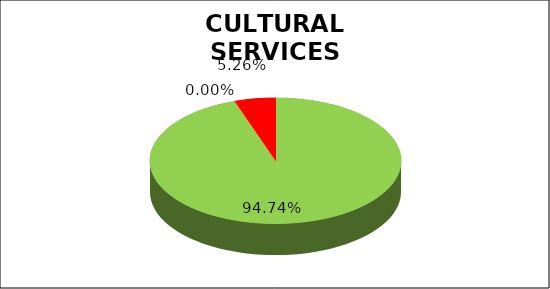
| Category | Series 0 |
|---|---|
| Green | 0.947 |
| Amber | 0 |
| Red | 0.053 |